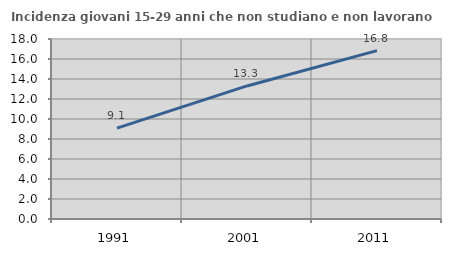
| Category | Incidenza giovani 15-29 anni che non studiano e non lavorano  |
|---|---|
| 1991.0 | 9.091 |
| 2001.0 | 13.306 |
| 2011.0 | 16.834 |